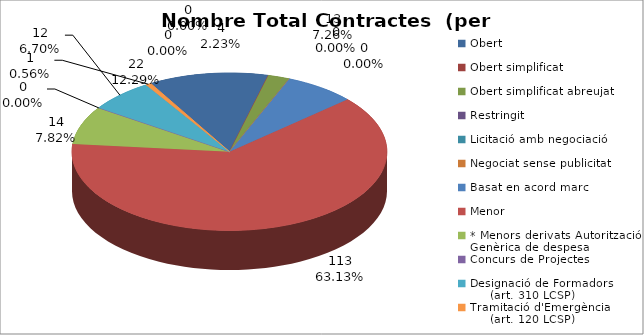
| Category | Nombre Total Contractes |
|---|---|
| Obert | 22 |
| Obert simplificat | 0 |
| Obert simplificat abreujat | 4 |
| Restringit | 0 |
| Licitació amb negociació | 0 |
| Negociat sense publicitat | 0 |
| Basat en acord marc | 13 |
| Menor | 113 |
| * Menors derivats Autorització Genèrica de despesa | 14 |
| Concurs de Projectes | 0 |
| Designació de Formadors
     (art. 310 LCSP) | 12 |
| Tramitació d'Emergència
     (art. 120 LCSP) | 1 |